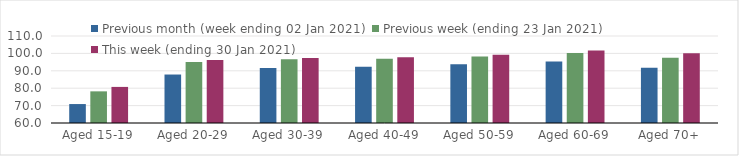
| Category | Previous month (week ending 02 Jan 2021) | Previous week (ending 23 Jan 2021) | This week (ending 30 Jan 2021) |
|---|---|---|---|
| Aged 15-19 | 70.89 | 78.19 | 80.74 |
| Aged 20-29 | 87.86 | 95.09 | 96.18 |
| Aged 30-39 | 91.64 | 96.62 | 97.36 |
| Aged 40-49 | 92.33 | 96.95 | 97.72 |
| Aged 50-59 | 93.79 | 98.25 | 99.26 |
| Aged 60-69 | 95.31 | 100.29 | 101.71 |
| Aged 70+ | 91.74 | 97.57 | 100.1 |